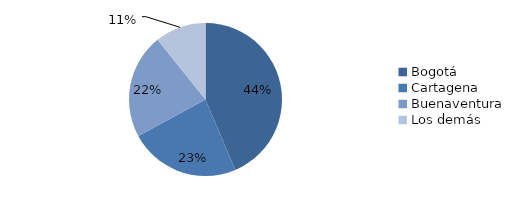
| Category | Series 0 |
|---|---|
| Bogotá | 390.497 |
| Cartagena | 209.699 |
| Buenaventura | 198.387 |
| Los demás | 96.371 |